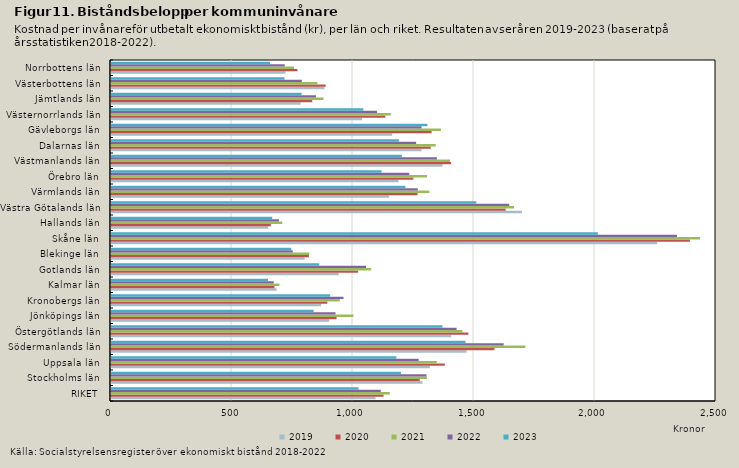
| Category | 2019 | 2020 | 2021 | 2022 | 2023 |
|---|---|---|---|---|---|
| RIKET | 1093.041 | 1126.382 | 1152.152 | 1114.652 | 1022.87 |
| Stockholms län | 1287.17 | 1275.923 | 1305.465 | 1303.518 | 1198.051 |
| Uppsala län | 1317.84 | 1379.119 | 1346.149 | 1271.468 | 1179.232 |
| Södermanlands län | 1469.029 | 1584.483 | 1712.385 | 1622.581 | 1465.134 |
| Östergötlands län | 1405.319 | 1476.704 | 1451.732 | 1427.947 | 1369.791 |
| Jönköpings län | 901.591 | 931.995 | 1001.766 | 927.73 | 837.396 |
| Kronobergs län | 868.004 | 893.994 | 945.588 | 960.61 | 905.71 |
| Kalmar län | 684.54 | 675.381 | 696.04 | 672.409 | 648.781 |
| Gotlands län | 941.215 | 1021.002 | 1074.974 | 1053.781 | 860.371 |
| Blekinge län | 800.026 | 817.986 | 819.74 | 751.097 | 745.181 |
| Skåne län | 2257.164 | 2392.011 | 2434.589 | 2338.707 | 2011.821 |
| Hallands län | 649.352 | 660.478 | 707.818 | 694.072 | 666.224 |
| Västra Götalands län | 1697.827 | 1630.607 | 1665.682 | 1645.693 | 1509.426 |
| Värmlands län | 1149.338 | 1267.05 | 1315.505 | 1267.81 | 1216.424 |
| Örebro län | 1187.821 | 1249.276 | 1305.772 | 1232.386 | 1118.117 |
| Västmanlands län | 1369.567 | 1405.492 | 1400.96 | 1346.778 | 1201.764 |
| Dalarnas län | 1283.573 | 1321.279 | 1341.986 | 1260.906 | 1189.513 |
| Gävleborgs län | 1161.661 | 1324.81 | 1363.352 | 1283.325 | 1307.266 |
| Västernorrlands län | 1037.248 | 1133.619 | 1155.749 | 1099.306 | 1042.745 |
| Jämtlands län | 783.626 | 831.585 | 878.223 | 846.9 | 787.708 |
| Västerbottens län | 882.031 | 887.107 | 852.958 | 788.538 | 716.757 |
| Norrbottens län | 721.415 | 770.578 | 756.012 | 717.832 | 656.935 |